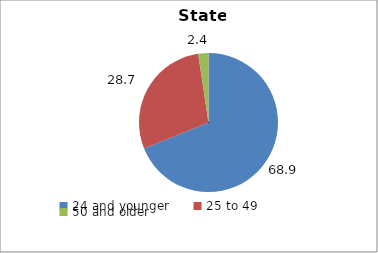
| Category | Series 0 | Series 1 |
|---|---|---|
| 24 and younger | 68.863 | 68.863 |
| 25 to 49 | 28.711 | 28.711 |
| 50 and older | 2.371 | 2.371 |